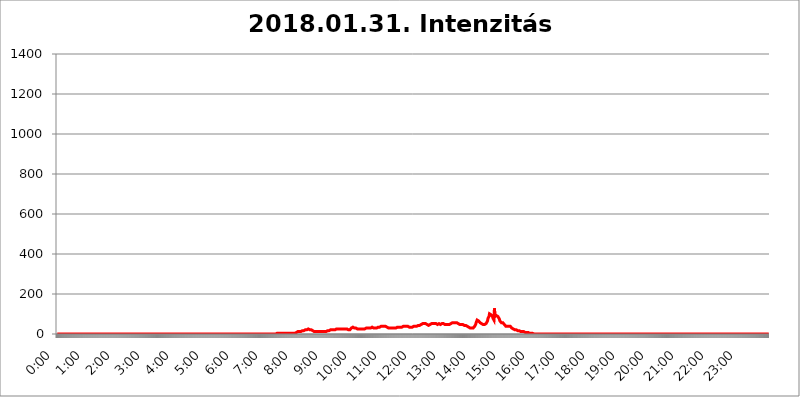
| Category | 2018.01.31. Intenzitás [W/m^2] |
|---|---|
| 0.0 | 0 |
| 0.0006944444444444445 | 0 |
| 0.001388888888888889 | 0 |
| 0.0020833333333333333 | 0 |
| 0.002777777777777778 | 0 |
| 0.003472222222222222 | 0 |
| 0.004166666666666667 | 0 |
| 0.004861111111111111 | 0 |
| 0.005555555555555556 | 0 |
| 0.0062499999999999995 | 0 |
| 0.006944444444444444 | 0 |
| 0.007638888888888889 | 0 |
| 0.008333333333333333 | 0 |
| 0.009027777777777779 | 0 |
| 0.009722222222222222 | 0 |
| 0.010416666666666666 | 0 |
| 0.011111111111111112 | 0 |
| 0.011805555555555555 | 0 |
| 0.012499999999999999 | 0 |
| 0.013194444444444444 | 0 |
| 0.013888888888888888 | 0 |
| 0.014583333333333332 | 0 |
| 0.015277777777777777 | 0 |
| 0.015972222222222224 | 0 |
| 0.016666666666666666 | 0 |
| 0.017361111111111112 | 0 |
| 0.018055555555555557 | 0 |
| 0.01875 | 0 |
| 0.019444444444444445 | 0 |
| 0.02013888888888889 | 0 |
| 0.020833333333333332 | 0 |
| 0.02152777777777778 | 0 |
| 0.022222222222222223 | 0 |
| 0.02291666666666667 | 0 |
| 0.02361111111111111 | 0 |
| 0.024305555555555556 | 0 |
| 0.024999999999999998 | 0 |
| 0.025694444444444447 | 0 |
| 0.02638888888888889 | 0 |
| 0.027083333333333334 | 0 |
| 0.027777777777777776 | 0 |
| 0.02847222222222222 | 0 |
| 0.029166666666666664 | 0 |
| 0.029861111111111113 | 0 |
| 0.030555555555555555 | 0 |
| 0.03125 | 0 |
| 0.03194444444444445 | 0 |
| 0.03263888888888889 | 0 |
| 0.03333333333333333 | 0 |
| 0.034027777777777775 | 0 |
| 0.034722222222222224 | 0 |
| 0.035416666666666666 | 0 |
| 0.036111111111111115 | 0 |
| 0.03680555555555556 | 0 |
| 0.0375 | 0 |
| 0.03819444444444444 | 0 |
| 0.03888888888888889 | 0 |
| 0.03958333333333333 | 0 |
| 0.04027777777777778 | 0 |
| 0.04097222222222222 | 0 |
| 0.041666666666666664 | 0 |
| 0.042361111111111106 | 0 |
| 0.04305555555555556 | 0 |
| 0.043750000000000004 | 0 |
| 0.044444444444444446 | 0 |
| 0.04513888888888889 | 0 |
| 0.04583333333333334 | 0 |
| 0.04652777777777778 | 0 |
| 0.04722222222222222 | 0 |
| 0.04791666666666666 | 0 |
| 0.04861111111111111 | 0 |
| 0.049305555555555554 | 0 |
| 0.049999999999999996 | 0 |
| 0.05069444444444445 | 0 |
| 0.051388888888888894 | 0 |
| 0.052083333333333336 | 0 |
| 0.05277777777777778 | 0 |
| 0.05347222222222222 | 0 |
| 0.05416666666666667 | 0 |
| 0.05486111111111111 | 0 |
| 0.05555555555555555 | 0 |
| 0.05625 | 0 |
| 0.05694444444444444 | 0 |
| 0.057638888888888885 | 0 |
| 0.05833333333333333 | 0 |
| 0.05902777777777778 | 0 |
| 0.059722222222222225 | 0 |
| 0.06041666666666667 | 0 |
| 0.061111111111111116 | 0 |
| 0.06180555555555556 | 0 |
| 0.0625 | 0 |
| 0.06319444444444444 | 0 |
| 0.06388888888888888 | 0 |
| 0.06458333333333334 | 0 |
| 0.06527777777777778 | 0 |
| 0.06597222222222222 | 0 |
| 0.06666666666666667 | 0 |
| 0.06736111111111111 | 0 |
| 0.06805555555555555 | 0 |
| 0.06874999999999999 | 0 |
| 0.06944444444444443 | 0 |
| 0.07013888888888889 | 0 |
| 0.07083333333333333 | 0 |
| 0.07152777777777779 | 0 |
| 0.07222222222222223 | 0 |
| 0.07291666666666667 | 0 |
| 0.07361111111111111 | 0 |
| 0.07430555555555556 | 0 |
| 0.075 | 0 |
| 0.07569444444444444 | 0 |
| 0.0763888888888889 | 0 |
| 0.07708333333333334 | 0 |
| 0.07777777777777778 | 0 |
| 0.07847222222222222 | 0 |
| 0.07916666666666666 | 0 |
| 0.0798611111111111 | 0 |
| 0.08055555555555556 | 0 |
| 0.08125 | 0 |
| 0.08194444444444444 | 0 |
| 0.08263888888888889 | 0 |
| 0.08333333333333333 | 0 |
| 0.08402777777777777 | 0 |
| 0.08472222222222221 | 0 |
| 0.08541666666666665 | 0 |
| 0.08611111111111112 | 0 |
| 0.08680555555555557 | 0 |
| 0.08750000000000001 | 0 |
| 0.08819444444444445 | 0 |
| 0.08888888888888889 | 0 |
| 0.08958333333333333 | 0 |
| 0.09027777777777778 | 0 |
| 0.09097222222222222 | 0 |
| 0.09166666666666667 | 0 |
| 0.09236111111111112 | 0 |
| 0.09305555555555556 | 0 |
| 0.09375 | 0 |
| 0.09444444444444444 | 0 |
| 0.09513888888888888 | 0 |
| 0.09583333333333333 | 0 |
| 0.09652777777777777 | 0 |
| 0.09722222222222222 | 0 |
| 0.09791666666666667 | 0 |
| 0.09861111111111111 | 0 |
| 0.09930555555555555 | 0 |
| 0.09999999999999999 | 0 |
| 0.10069444444444443 | 0 |
| 0.1013888888888889 | 0 |
| 0.10208333333333335 | 0 |
| 0.10277777777777779 | 0 |
| 0.10347222222222223 | 0 |
| 0.10416666666666667 | 0 |
| 0.10486111111111111 | 0 |
| 0.10555555555555556 | 0 |
| 0.10625 | 0 |
| 0.10694444444444444 | 0 |
| 0.1076388888888889 | 0 |
| 0.10833333333333334 | 0 |
| 0.10902777777777778 | 0 |
| 0.10972222222222222 | 0 |
| 0.1111111111111111 | 0 |
| 0.11180555555555556 | 0 |
| 0.11180555555555556 | 0 |
| 0.1125 | 0 |
| 0.11319444444444444 | 0 |
| 0.11388888888888889 | 0 |
| 0.11458333333333333 | 0 |
| 0.11527777777777777 | 0 |
| 0.11597222222222221 | 0 |
| 0.11666666666666665 | 0 |
| 0.1173611111111111 | 0 |
| 0.11805555555555557 | 0 |
| 0.11944444444444445 | 0 |
| 0.12013888888888889 | 0 |
| 0.12083333333333333 | 0 |
| 0.12152777777777778 | 0 |
| 0.12222222222222223 | 0 |
| 0.12291666666666667 | 0 |
| 0.12291666666666667 | 0 |
| 0.12361111111111112 | 0 |
| 0.12430555555555556 | 0 |
| 0.125 | 0 |
| 0.12569444444444444 | 0 |
| 0.12638888888888888 | 0 |
| 0.12708333333333333 | 0 |
| 0.16875 | 0 |
| 0.12847222222222224 | 0 |
| 0.12916666666666668 | 0 |
| 0.12986111111111112 | 0 |
| 0.13055555555555556 | 0 |
| 0.13125 | 0 |
| 0.13194444444444445 | 0 |
| 0.1326388888888889 | 0 |
| 0.13333333333333333 | 0 |
| 0.13402777777777777 | 0 |
| 0.13402777777777777 | 0 |
| 0.13472222222222222 | 0 |
| 0.13541666666666666 | 0 |
| 0.1361111111111111 | 0 |
| 0.13749999999999998 | 0 |
| 0.13819444444444443 | 0 |
| 0.1388888888888889 | 0 |
| 0.13958333333333334 | 0 |
| 0.14027777777777778 | 0 |
| 0.14097222222222222 | 0 |
| 0.14166666666666666 | 0 |
| 0.1423611111111111 | 0 |
| 0.14305555555555557 | 0 |
| 0.14375000000000002 | 0 |
| 0.14444444444444446 | 0 |
| 0.1451388888888889 | 0 |
| 0.1451388888888889 | 0 |
| 0.14652777777777778 | 0 |
| 0.14722222222222223 | 0 |
| 0.14791666666666667 | 0 |
| 0.1486111111111111 | 0 |
| 0.14930555555555555 | 0 |
| 0.15 | 0 |
| 0.15069444444444444 | 0 |
| 0.15138888888888888 | 0 |
| 0.15208333333333332 | 0 |
| 0.15277777777777776 | 0 |
| 0.15347222222222223 | 0 |
| 0.15416666666666667 | 0 |
| 0.15486111111111112 | 0 |
| 0.15555555555555556 | 0 |
| 0.15625 | 0 |
| 0.15694444444444444 | 0 |
| 0.15763888888888888 | 0 |
| 0.15833333333333333 | 0 |
| 0.15902777777777777 | 0 |
| 0.15972222222222224 | 0 |
| 0.16041666666666668 | 0 |
| 0.16111111111111112 | 0 |
| 0.16180555555555556 | 0 |
| 0.1625 | 0 |
| 0.16319444444444445 | 0 |
| 0.1638888888888889 | 0 |
| 0.16458333333333333 | 0 |
| 0.16527777777777777 | 0 |
| 0.16597222222222222 | 0 |
| 0.16666666666666666 | 0 |
| 0.1673611111111111 | 0 |
| 0.16805555555555554 | 0 |
| 0.16874999999999998 | 0 |
| 0.16944444444444443 | 0 |
| 0.17013888888888887 | 0 |
| 0.1708333333333333 | 0 |
| 0.17152777777777775 | 0 |
| 0.17222222222222225 | 0 |
| 0.1729166666666667 | 0 |
| 0.17361111111111113 | 0 |
| 0.17430555555555557 | 0 |
| 0.17500000000000002 | 0 |
| 0.17569444444444446 | 0 |
| 0.1763888888888889 | 0 |
| 0.17708333333333334 | 0 |
| 0.17777777777777778 | 0 |
| 0.17847222222222223 | 0 |
| 0.17916666666666667 | 0 |
| 0.1798611111111111 | 0 |
| 0.18055555555555555 | 0 |
| 0.18125 | 0 |
| 0.18194444444444444 | 0 |
| 0.1826388888888889 | 0 |
| 0.18333333333333335 | 0 |
| 0.1840277777777778 | 0 |
| 0.18472222222222223 | 0 |
| 0.18541666666666667 | 0 |
| 0.18611111111111112 | 0 |
| 0.18680555555555556 | 0 |
| 0.1875 | 0 |
| 0.18819444444444444 | 0 |
| 0.18888888888888888 | 0 |
| 0.18958333333333333 | 0 |
| 0.19027777777777777 | 0 |
| 0.1909722222222222 | 0 |
| 0.19166666666666665 | 0 |
| 0.19236111111111112 | 0 |
| 0.19305555555555554 | 0 |
| 0.19375 | 0 |
| 0.19444444444444445 | 0 |
| 0.1951388888888889 | 0 |
| 0.19583333333333333 | 0 |
| 0.19652777777777777 | 0 |
| 0.19722222222222222 | 0 |
| 0.19791666666666666 | 0 |
| 0.1986111111111111 | 0 |
| 0.19930555555555554 | 0 |
| 0.19999999999999998 | 0 |
| 0.20069444444444443 | 0 |
| 0.20138888888888887 | 0 |
| 0.2020833333333333 | 0 |
| 0.2027777777777778 | 0 |
| 0.2034722222222222 | 0 |
| 0.2041666666666667 | 0 |
| 0.20486111111111113 | 0 |
| 0.20555555555555557 | 0 |
| 0.20625000000000002 | 0 |
| 0.20694444444444446 | 0 |
| 0.2076388888888889 | 0 |
| 0.20833333333333334 | 0 |
| 0.20902777777777778 | 0 |
| 0.20972222222222223 | 0 |
| 0.21041666666666667 | 0 |
| 0.2111111111111111 | 0 |
| 0.21180555555555555 | 0 |
| 0.2125 | 0 |
| 0.21319444444444444 | 0 |
| 0.2138888888888889 | 0 |
| 0.21458333333333335 | 0 |
| 0.2152777777777778 | 0 |
| 0.21597222222222223 | 0 |
| 0.21666666666666667 | 0 |
| 0.21736111111111112 | 0 |
| 0.21805555555555556 | 0 |
| 0.21875 | 0 |
| 0.21944444444444444 | 0 |
| 0.22013888888888888 | 0 |
| 0.22083333333333333 | 0 |
| 0.22152777777777777 | 0 |
| 0.2222222222222222 | 0 |
| 0.22291666666666665 | 0 |
| 0.2236111111111111 | 0 |
| 0.22430555555555556 | 0 |
| 0.225 | 0 |
| 0.22569444444444445 | 0 |
| 0.2263888888888889 | 0 |
| 0.22708333333333333 | 0 |
| 0.22777777777777777 | 0 |
| 0.22847222222222222 | 0 |
| 0.22916666666666666 | 0 |
| 0.2298611111111111 | 0 |
| 0.23055555555555554 | 0 |
| 0.23124999999999998 | 0 |
| 0.23194444444444443 | 0 |
| 0.23263888888888887 | 0 |
| 0.2333333333333333 | 0 |
| 0.2340277777777778 | 0 |
| 0.2347222222222222 | 0 |
| 0.2354166666666667 | 0 |
| 0.23611111111111113 | 0 |
| 0.23680555555555557 | 0 |
| 0.23750000000000002 | 0 |
| 0.23819444444444446 | 0 |
| 0.2388888888888889 | 0 |
| 0.23958333333333334 | 0 |
| 0.24027777777777778 | 0 |
| 0.24097222222222223 | 0 |
| 0.24166666666666667 | 0 |
| 0.2423611111111111 | 0 |
| 0.24305555555555555 | 0 |
| 0.24375 | 0 |
| 0.24444444444444446 | 0 |
| 0.24513888888888888 | 0 |
| 0.24583333333333335 | 0 |
| 0.2465277777777778 | 0 |
| 0.24722222222222223 | 0 |
| 0.24791666666666667 | 0 |
| 0.24861111111111112 | 0 |
| 0.24930555555555556 | 0 |
| 0.25 | 0 |
| 0.25069444444444444 | 0 |
| 0.2513888888888889 | 0 |
| 0.2520833333333333 | 0 |
| 0.25277777777777777 | 0 |
| 0.2534722222222222 | 0 |
| 0.25416666666666665 | 0 |
| 0.2548611111111111 | 0 |
| 0.2555555555555556 | 0 |
| 0.25625000000000003 | 0 |
| 0.2569444444444445 | 0 |
| 0.2576388888888889 | 0 |
| 0.25833333333333336 | 0 |
| 0.2590277777777778 | 0 |
| 0.25972222222222224 | 0 |
| 0.2604166666666667 | 0 |
| 0.2611111111111111 | 0 |
| 0.26180555555555557 | 0 |
| 0.2625 | 0 |
| 0.26319444444444445 | 0 |
| 0.2638888888888889 | 0 |
| 0.26458333333333334 | 0 |
| 0.2652777777777778 | 0 |
| 0.2659722222222222 | 0 |
| 0.26666666666666666 | 0 |
| 0.2673611111111111 | 0 |
| 0.26805555555555555 | 0 |
| 0.26875 | 0 |
| 0.26944444444444443 | 0 |
| 0.2701388888888889 | 0 |
| 0.2708333333333333 | 0 |
| 0.27152777777777776 | 0 |
| 0.2722222222222222 | 0 |
| 0.27291666666666664 | 0 |
| 0.2736111111111111 | 0 |
| 0.2743055555555555 | 0 |
| 0.27499999999999997 | 0 |
| 0.27569444444444446 | 0 |
| 0.27638888888888885 | 0 |
| 0.27708333333333335 | 0 |
| 0.2777777777777778 | 0 |
| 0.27847222222222223 | 0 |
| 0.2791666666666667 | 0 |
| 0.2798611111111111 | 0 |
| 0.28055555555555556 | 0 |
| 0.28125 | 0 |
| 0.28194444444444444 | 0 |
| 0.2826388888888889 | 0 |
| 0.2833333333333333 | 0 |
| 0.28402777777777777 | 0 |
| 0.2847222222222222 | 0 |
| 0.28541666666666665 | 0 |
| 0.28611111111111115 | 0 |
| 0.28680555555555554 | 0 |
| 0.28750000000000003 | 0 |
| 0.2881944444444445 | 0 |
| 0.2888888888888889 | 0 |
| 0.28958333333333336 | 0 |
| 0.2902777777777778 | 0 |
| 0.29097222222222224 | 0 |
| 0.2916666666666667 | 0 |
| 0.2923611111111111 | 0 |
| 0.29305555555555557 | 0 |
| 0.29375 | 0 |
| 0.29444444444444445 | 0 |
| 0.2951388888888889 | 0 |
| 0.29583333333333334 | 0 |
| 0.2965277777777778 | 0 |
| 0.2972222222222222 | 0 |
| 0.29791666666666666 | 0 |
| 0.2986111111111111 | 0 |
| 0.29930555555555555 | 0 |
| 0.3 | 0 |
| 0.30069444444444443 | 0 |
| 0.3013888888888889 | 0 |
| 0.3020833333333333 | 0 |
| 0.30277777777777776 | 0 |
| 0.3034722222222222 | 0 |
| 0.30416666666666664 | 0 |
| 0.3048611111111111 | 0 |
| 0.3055555555555555 | 0 |
| 0.30624999999999997 | 0 |
| 0.3069444444444444 | 3.525 |
| 0.3076388888888889 | 0 |
| 0.30833333333333335 | 3.525 |
| 0.3090277777777778 | 3.525 |
| 0.30972222222222223 | 3.525 |
| 0.3104166666666667 | 3.525 |
| 0.3111111111111111 | 3.525 |
| 0.31180555555555556 | 3.525 |
| 0.3125 | 3.525 |
| 0.31319444444444444 | 3.525 |
| 0.3138888888888889 | 3.525 |
| 0.3145833333333333 | 3.525 |
| 0.31527777777777777 | 3.525 |
| 0.3159722222222222 | 3.525 |
| 0.31666666666666665 | 3.525 |
| 0.31736111111111115 | 3.525 |
| 0.31805555555555554 | 3.525 |
| 0.31875000000000003 | 3.525 |
| 0.3194444444444445 | 3.525 |
| 0.3201388888888889 | 3.525 |
| 0.32083333333333336 | 3.525 |
| 0.3215277777777778 | 3.525 |
| 0.32222222222222224 | 3.525 |
| 0.3229166666666667 | 3.525 |
| 0.3236111111111111 | 3.525 |
| 0.32430555555555557 | 3.525 |
| 0.325 | 3.525 |
| 0.32569444444444445 | 3.525 |
| 0.3263888888888889 | 3.525 |
| 0.32708333333333334 | 3.525 |
| 0.3277777777777778 | 3.525 |
| 0.3284722222222222 | 3.525 |
| 0.32916666666666666 | 3.525 |
| 0.3298611111111111 | 3.525 |
| 0.33055555555555555 | 3.525 |
| 0.33125 | 3.525 |
| 0.33194444444444443 | 3.525 |
| 0.3326388888888889 | 3.525 |
| 0.3333333333333333 | 3.525 |
| 0.3340277777777778 | 7.887 |
| 0.3347222222222222 | 7.887 |
| 0.3354166666666667 | 7.887 |
| 0.3361111111111111 | 7.887 |
| 0.3368055555555556 | 7.887 |
| 0.33749999999999997 | 12.257 |
| 0.33819444444444446 | 12.257 |
| 0.33888888888888885 | 12.257 |
| 0.33958333333333335 | 12.257 |
| 0.34027777777777773 | 12.257 |
| 0.34097222222222223 | 12.257 |
| 0.3416666666666666 | 12.257 |
| 0.3423611111111111 | 12.257 |
| 0.3430555555555555 | 12.257 |
| 0.34375 | 16.636 |
| 0.3444444444444445 | 16.636 |
| 0.3451388888888889 | 16.636 |
| 0.3458333333333334 | 16.636 |
| 0.34652777777777777 | 16.636 |
| 0.34722222222222227 | 16.636 |
| 0.34791666666666665 | 21.024 |
| 0.34861111111111115 | 21.024 |
| 0.34930555555555554 | 21.024 |
| 0.35000000000000003 | 21.024 |
| 0.3506944444444444 | 25.419 |
| 0.3513888888888889 | 25.419 |
| 0.3520833333333333 | 25.419 |
| 0.3527777777777778 | 21.024 |
| 0.3534722222222222 | 21.024 |
| 0.3541666666666667 | 21.024 |
| 0.3548611111111111 | 21.024 |
| 0.35555555555555557 | 21.024 |
| 0.35625 | 21.024 |
| 0.35694444444444445 | 16.636 |
| 0.3576388888888889 | 16.636 |
| 0.35833333333333334 | 16.636 |
| 0.3590277777777778 | 16.636 |
| 0.3597222222222222 | 12.257 |
| 0.36041666666666666 | 12.257 |
| 0.3611111111111111 | 12.257 |
| 0.36180555555555555 | 16.636 |
| 0.3625 | 12.257 |
| 0.36319444444444443 | 12.257 |
| 0.3638888888888889 | 12.257 |
| 0.3645833333333333 | 12.257 |
| 0.3652777777777778 | 16.636 |
| 0.3659722222222222 | 12.257 |
| 0.3666666666666667 | 12.257 |
| 0.3673611111111111 | 12.257 |
| 0.3680555555555556 | 12.257 |
| 0.36874999999999997 | 12.257 |
| 0.36944444444444446 | 12.257 |
| 0.37013888888888885 | 12.257 |
| 0.37083333333333335 | 12.257 |
| 0.37152777777777773 | 12.257 |
| 0.37222222222222223 | 12.257 |
| 0.3729166666666666 | 12.257 |
| 0.3736111111111111 | 12.257 |
| 0.3743055555555555 | 12.257 |
| 0.375 | 12.257 |
| 0.3756944444444445 | 12.257 |
| 0.3763888888888889 | 12.257 |
| 0.3770833333333334 | 12.257 |
| 0.37777777777777777 | 12.257 |
| 0.37847222222222227 | 12.257 |
| 0.37916666666666665 | 16.636 |
| 0.37986111111111115 | 16.636 |
| 0.38055555555555554 | 16.636 |
| 0.38125000000000003 | 16.636 |
| 0.3819444444444444 | 16.636 |
| 0.3826388888888889 | 16.636 |
| 0.3833333333333333 | 21.024 |
| 0.3840277777777778 | 21.024 |
| 0.3847222222222222 | 21.024 |
| 0.3854166666666667 | 21.024 |
| 0.3861111111111111 | 21.024 |
| 0.38680555555555557 | 21.024 |
| 0.3875 | 21.024 |
| 0.38819444444444445 | 21.024 |
| 0.3888888888888889 | 21.024 |
| 0.38958333333333334 | 21.024 |
| 0.3902777777777778 | 21.024 |
| 0.3909722222222222 | 21.024 |
| 0.39166666666666666 | 25.419 |
| 0.3923611111111111 | 25.419 |
| 0.39305555555555555 | 25.419 |
| 0.39375 | 25.419 |
| 0.39444444444444443 | 29.823 |
| 0.3951388888888889 | 25.419 |
| 0.3958333333333333 | 25.419 |
| 0.3965277777777778 | 25.419 |
| 0.3972222222222222 | 25.419 |
| 0.3979166666666667 | 25.419 |
| 0.3986111111111111 | 25.419 |
| 0.3993055555555556 | 21.024 |
| 0.39999999999999997 | 25.419 |
| 0.40069444444444446 | 25.419 |
| 0.40138888888888885 | 25.419 |
| 0.40208333333333335 | 25.419 |
| 0.40277777777777773 | 21.024 |
| 0.40347222222222223 | 21.024 |
| 0.4041666666666666 | 25.419 |
| 0.4048611111111111 | 25.419 |
| 0.4055555555555555 | 25.419 |
| 0.40625 | 25.419 |
| 0.4069444444444445 | 21.024 |
| 0.4076388888888889 | 21.024 |
| 0.4083333333333334 | 21.024 |
| 0.40902777777777777 | 21.024 |
| 0.40972222222222227 | 21.024 |
| 0.41041666666666665 | 21.024 |
| 0.41111111111111115 | 21.024 |
| 0.41180555555555554 | 25.419 |
| 0.41250000000000003 | 29.823 |
| 0.4131944444444444 | 29.823 |
| 0.4138888888888889 | 34.234 |
| 0.4145833333333333 | 34.234 |
| 0.4152777777777778 | 34.234 |
| 0.4159722222222222 | 34.234 |
| 0.4166666666666667 | 29.823 |
| 0.4173611111111111 | 29.823 |
| 0.41805555555555557 | 29.823 |
| 0.41875 | 29.823 |
| 0.41944444444444445 | 29.823 |
| 0.4201388888888889 | 25.419 |
| 0.42083333333333334 | 25.419 |
| 0.4215277777777778 | 21.024 |
| 0.4222222222222222 | 21.024 |
| 0.42291666666666666 | 25.419 |
| 0.4236111111111111 | 25.419 |
| 0.42430555555555555 | 25.419 |
| 0.425 | 25.419 |
| 0.42569444444444443 | 25.419 |
| 0.4263888888888889 | 25.419 |
| 0.4270833333333333 | 25.419 |
| 0.4277777777777778 | 25.419 |
| 0.4284722222222222 | 25.419 |
| 0.4291666666666667 | 25.419 |
| 0.4298611111111111 | 25.419 |
| 0.4305555555555556 | 25.419 |
| 0.43124999999999997 | 25.419 |
| 0.43194444444444446 | 25.419 |
| 0.43263888888888885 | 25.419 |
| 0.43333333333333335 | 29.823 |
| 0.43402777777777773 | 29.823 |
| 0.43472222222222223 | 29.823 |
| 0.4354166666666666 | 29.823 |
| 0.4361111111111111 | 29.823 |
| 0.4368055555555555 | 29.823 |
| 0.4375 | 29.823 |
| 0.4381944444444445 | 29.823 |
| 0.4388888888888889 | 29.823 |
| 0.4395833333333334 | 29.823 |
| 0.44027777777777777 | 34.234 |
| 0.44097222222222227 | 34.234 |
| 0.44166666666666665 | 34.234 |
| 0.44236111111111115 | 34.234 |
| 0.44305555555555554 | 29.823 |
| 0.44375000000000003 | 29.823 |
| 0.4444444444444444 | 29.823 |
| 0.4451388888888889 | 29.823 |
| 0.4458333333333333 | 29.823 |
| 0.4465277777777778 | 29.823 |
| 0.4472222222222222 | 29.823 |
| 0.4479166666666667 | 29.823 |
| 0.4486111111111111 | 29.823 |
| 0.44930555555555557 | 34.234 |
| 0.45 | 34.234 |
| 0.45069444444444445 | 34.234 |
| 0.4513888888888889 | 34.234 |
| 0.45208333333333334 | 34.234 |
| 0.4527777777777778 | 34.234 |
| 0.4534722222222222 | 38.653 |
| 0.45416666666666666 | 38.653 |
| 0.4548611111111111 | 38.653 |
| 0.45555555555555555 | 38.653 |
| 0.45625 | 38.653 |
| 0.45694444444444443 | 38.653 |
| 0.4576388888888889 | 38.653 |
| 0.4583333333333333 | 38.653 |
| 0.4590277777777778 | 38.653 |
| 0.4597222222222222 | 38.653 |
| 0.4604166666666667 | 38.653 |
| 0.4611111111111111 | 34.234 |
| 0.4618055555555556 | 34.234 |
| 0.46249999999999997 | 34.234 |
| 0.46319444444444446 | 34.234 |
| 0.46388888888888885 | 29.823 |
| 0.46458333333333335 | 29.823 |
| 0.46527777777777773 | 34.234 |
| 0.46597222222222223 | 34.234 |
| 0.4666666666666666 | 29.823 |
| 0.4673611111111111 | 29.823 |
| 0.4680555555555555 | 29.823 |
| 0.46875 | 29.823 |
| 0.4694444444444445 | 29.823 |
| 0.4701388888888889 | 29.823 |
| 0.4708333333333334 | 29.823 |
| 0.47152777777777777 | 29.823 |
| 0.47222222222222227 | 29.823 |
| 0.47291666666666665 | 29.823 |
| 0.47361111111111115 | 29.823 |
| 0.47430555555555554 | 29.823 |
| 0.47500000000000003 | 29.823 |
| 0.4756944444444444 | 29.823 |
| 0.4763888888888889 | 29.823 |
| 0.4770833333333333 | 34.234 |
| 0.4777777777777778 | 34.234 |
| 0.4784722222222222 | 34.234 |
| 0.4791666666666667 | 34.234 |
| 0.4798611111111111 | 34.234 |
| 0.48055555555555557 | 29.823 |
| 0.48125 | 34.234 |
| 0.48194444444444445 | 34.234 |
| 0.4826388888888889 | 34.234 |
| 0.48333333333333334 | 34.234 |
| 0.4840277777777778 | 38.653 |
| 0.4847222222222222 | 38.653 |
| 0.48541666666666666 | 38.653 |
| 0.4861111111111111 | 38.653 |
| 0.48680555555555555 | 38.653 |
| 0.4875 | 38.653 |
| 0.48819444444444443 | 38.653 |
| 0.4888888888888889 | 38.653 |
| 0.4895833333333333 | 38.653 |
| 0.4902777777777778 | 38.653 |
| 0.4909722222222222 | 38.653 |
| 0.4916666666666667 | 38.653 |
| 0.4923611111111111 | 34.234 |
| 0.4930555555555556 | 34.234 |
| 0.49374999999999997 | 34.234 |
| 0.49444444444444446 | 34.234 |
| 0.49513888888888885 | 34.234 |
| 0.49583333333333335 | 34.234 |
| 0.49652777777777773 | 34.234 |
| 0.49722222222222223 | 34.234 |
| 0.4979166666666666 | 34.234 |
| 0.4986111111111111 | 34.234 |
| 0.4993055555555555 | 34.234 |
| 0.5 | 38.653 |
| 0.5006944444444444 | 38.653 |
| 0.5013888888888889 | 38.653 |
| 0.5020833333333333 | 38.653 |
| 0.5027777777777778 | 38.653 |
| 0.5034722222222222 | 38.653 |
| 0.5041666666666667 | 38.653 |
| 0.5048611111111111 | 38.653 |
| 0.5055555555555555 | 43.079 |
| 0.50625 | 43.079 |
| 0.5069444444444444 | 43.079 |
| 0.5076388888888889 | 43.079 |
| 0.5083333333333333 | 43.079 |
| 0.5090277777777777 | 43.079 |
| 0.5097222222222222 | 43.079 |
| 0.5104166666666666 | 47.511 |
| 0.5111111111111112 | 47.511 |
| 0.5118055555555555 | 51.951 |
| 0.5125000000000001 | 51.951 |
| 0.5131944444444444 | 56.398 |
| 0.513888888888889 | 56.398 |
| 0.5145833333333333 | 51.951 |
| 0.5152777777777778 | 51.951 |
| 0.5159722222222222 | 51.951 |
| 0.5166666666666667 | 51.951 |
| 0.517361111111111 | 51.951 |
| 0.5180555555555556 | 47.511 |
| 0.5187499999999999 | 47.511 |
| 0.5194444444444445 | 43.079 |
| 0.5201388888888888 | 43.079 |
| 0.5208333333333334 | 43.079 |
| 0.5215277777777778 | 47.511 |
| 0.5222222222222223 | 47.511 |
| 0.5229166666666667 | 47.511 |
| 0.5236111111111111 | 47.511 |
| 0.5243055555555556 | 47.511 |
| 0.525 | 51.951 |
| 0.5256944444444445 | 51.951 |
| 0.5263888888888889 | 51.951 |
| 0.5270833333333333 | 51.951 |
| 0.5277777777777778 | 51.951 |
| 0.5284722222222222 | 51.951 |
| 0.5291666666666667 | 51.951 |
| 0.5298611111111111 | 51.951 |
| 0.5305555555555556 | 51.951 |
| 0.53125 | 51.951 |
| 0.5319444444444444 | 47.511 |
| 0.5326388888888889 | 47.511 |
| 0.5333333333333333 | 47.511 |
| 0.5340277777777778 | 51.951 |
| 0.5347222222222222 | 47.511 |
| 0.5354166666666667 | 51.951 |
| 0.5361111111111111 | 51.951 |
| 0.5368055555555555 | 51.951 |
| 0.5375 | 47.511 |
| 0.5381944444444444 | 47.511 |
| 0.5388888888888889 | 47.511 |
| 0.5395833333333333 | 51.951 |
| 0.5402777777777777 | 47.511 |
| 0.5409722222222222 | 47.511 |
| 0.5416666666666666 | 51.951 |
| 0.5423611111111112 | 47.511 |
| 0.5430555555555555 | 47.511 |
| 0.5437500000000001 | 47.511 |
| 0.5444444444444444 | 47.511 |
| 0.545138888888889 | 47.511 |
| 0.5458333333333333 | 47.511 |
| 0.5465277777777778 | 47.511 |
| 0.5472222222222222 | 47.511 |
| 0.5479166666666667 | 47.511 |
| 0.548611111111111 | 47.511 |
| 0.5493055555555556 | 47.511 |
| 0.5499999999999999 | 47.511 |
| 0.5506944444444445 | 47.511 |
| 0.5513888888888888 | 47.511 |
| 0.5520833333333334 | 51.951 |
| 0.5527777777777778 | 51.951 |
| 0.5534722222222223 | 51.951 |
| 0.5541666666666667 | 56.398 |
| 0.5548611111111111 | 56.398 |
| 0.5555555555555556 | 56.398 |
| 0.55625 | 56.398 |
| 0.5569444444444445 | 56.398 |
| 0.5576388888888889 | 56.398 |
| 0.5583333333333333 | 56.398 |
| 0.5590277777777778 | 56.398 |
| 0.5597222222222222 | 56.398 |
| 0.5604166666666667 | 56.398 |
| 0.5611111111111111 | 56.398 |
| 0.5618055555555556 | 51.951 |
| 0.5625 | 51.951 |
| 0.5631944444444444 | 47.511 |
| 0.5638888888888889 | 47.511 |
| 0.5645833333333333 | 47.511 |
| 0.5652777777777778 | 47.511 |
| 0.5659722222222222 | 47.511 |
| 0.5666666666666667 | 47.511 |
| 0.5673611111111111 | 47.511 |
| 0.5680555555555555 | 47.511 |
| 0.56875 | 47.511 |
| 0.5694444444444444 | 47.511 |
| 0.5701388888888889 | 47.511 |
| 0.5708333333333333 | 43.079 |
| 0.5715277777777777 | 43.079 |
| 0.5722222222222222 | 43.079 |
| 0.5729166666666666 | 43.079 |
| 0.5736111111111112 | 38.653 |
| 0.5743055555555555 | 38.653 |
| 0.5750000000000001 | 38.653 |
| 0.5756944444444444 | 38.653 |
| 0.576388888888889 | 34.234 |
| 0.5770833333333333 | 34.234 |
| 0.5777777777777778 | 29.823 |
| 0.5784722222222222 | 29.823 |
| 0.5791666666666667 | 29.823 |
| 0.579861111111111 | 29.823 |
| 0.5805555555555556 | 29.823 |
| 0.5812499999999999 | 29.823 |
| 0.5819444444444445 | 29.823 |
| 0.5826388888888888 | 29.823 |
| 0.5833333333333334 | 29.823 |
| 0.5840277777777778 | 34.234 |
| 0.5847222222222223 | 34.234 |
| 0.5854166666666667 | 38.653 |
| 0.5861111111111111 | 43.079 |
| 0.5868055555555556 | 47.511 |
| 0.5875 | 56.398 |
| 0.5881944444444445 | 60.85 |
| 0.5888888888888889 | 69.775 |
| 0.5895833333333333 | 69.775 |
| 0.5902777777777778 | 69.775 |
| 0.5909722222222222 | 65.31 |
| 0.5916666666666667 | 65.31 |
| 0.5923611111111111 | 60.85 |
| 0.5930555555555556 | 56.398 |
| 0.59375 | 51.951 |
| 0.5944444444444444 | 51.951 |
| 0.5951388888888889 | 51.951 |
| 0.5958333333333333 | 51.951 |
| 0.5965277777777778 | 51.951 |
| 0.5972222222222222 | 47.511 |
| 0.5979166666666667 | 47.511 |
| 0.5986111111111111 | 47.511 |
| 0.5993055555555555 | 47.511 |
| 0.6 | 47.511 |
| 0.6006944444444444 | 51.951 |
| 0.6013888888888889 | 51.951 |
| 0.6020833333333333 | 47.511 |
| 0.6027777777777777 | 51.951 |
| 0.6034722222222222 | 65.31 |
| 0.6041666666666666 | 78.722 |
| 0.6048611111111112 | 83.205 |
| 0.6055555555555555 | 87.692 |
| 0.6062500000000001 | 101.184 |
| 0.6069444444444444 | 105.69 |
| 0.607638888888889 | 101.184 |
| 0.6083333333333333 | 96.682 |
| 0.6090277777777778 | 96.682 |
| 0.6097222222222222 | 92.184 |
| 0.6104166666666667 | 87.692 |
| 0.611111111111111 | 78.722 |
| 0.6118055555555556 | 74.246 |
| 0.6124999999999999 | 69.775 |
| 0.6131944444444445 | 128.284 |
| 0.6138888888888888 | 87.692 |
| 0.6145833333333334 | 83.205 |
| 0.6152777777777778 | 92.184 |
| 0.6159722222222223 | 92.184 |
| 0.6166666666666667 | 92.184 |
| 0.6173611111111111 | 92.184 |
| 0.6180555555555556 | 87.692 |
| 0.61875 | 83.205 |
| 0.6194444444444445 | 83.205 |
| 0.6201388888888889 | 74.246 |
| 0.6208333333333333 | 65.31 |
| 0.6215277777777778 | 60.85 |
| 0.6222222222222222 | 60.85 |
| 0.6229166666666667 | 56.398 |
| 0.6236111111111111 | 56.398 |
| 0.6243055555555556 | 56.398 |
| 0.625 | 56.398 |
| 0.6256944444444444 | 56.398 |
| 0.6263888888888889 | 51.951 |
| 0.6270833333333333 | 47.511 |
| 0.6277777777777778 | 43.079 |
| 0.6284722222222222 | 43.079 |
| 0.6291666666666667 | 38.653 |
| 0.6298611111111111 | 38.653 |
| 0.6305555555555555 | 38.653 |
| 0.63125 | 38.653 |
| 0.6319444444444444 | 38.653 |
| 0.6326388888888889 | 38.653 |
| 0.6333333333333333 | 38.653 |
| 0.6340277777777777 | 38.653 |
| 0.6347222222222222 | 38.653 |
| 0.6354166666666666 | 38.653 |
| 0.6361111111111112 | 38.653 |
| 0.6368055555555555 | 34.234 |
| 0.6375000000000001 | 29.823 |
| 0.6381944444444444 | 29.823 |
| 0.638888888888889 | 25.419 |
| 0.6395833333333333 | 25.419 |
| 0.6402777777777778 | 21.024 |
| 0.6409722222222222 | 21.024 |
| 0.6416666666666667 | 21.024 |
| 0.642361111111111 | 21.024 |
| 0.6430555555555556 | 21.024 |
| 0.6437499999999999 | 21.024 |
| 0.6444444444444445 | 21.024 |
| 0.6451388888888888 | 16.636 |
| 0.6458333333333334 | 16.636 |
| 0.6465277777777778 | 16.636 |
| 0.6472222222222223 | 16.636 |
| 0.6479166666666667 | 16.636 |
| 0.6486111111111111 | 16.636 |
| 0.6493055555555556 | 12.257 |
| 0.65 | 12.257 |
| 0.6506944444444445 | 12.257 |
| 0.6513888888888889 | 12.257 |
| 0.6520833333333333 | 12.257 |
| 0.6527777777777778 | 12.257 |
| 0.6534722222222222 | 12.257 |
| 0.6541666666666667 | 12.257 |
| 0.6548611111111111 | 12.257 |
| 0.6555555555555556 | 12.257 |
| 0.65625 | 7.887 |
| 0.6569444444444444 | 7.887 |
| 0.6576388888888889 | 7.887 |
| 0.6583333333333333 | 7.887 |
| 0.6590277777777778 | 7.887 |
| 0.6597222222222222 | 7.887 |
| 0.6604166666666667 | 7.887 |
| 0.6611111111111111 | 3.525 |
| 0.6618055555555555 | 3.525 |
| 0.6625 | 3.525 |
| 0.6631944444444444 | 3.525 |
| 0.6638888888888889 | 3.525 |
| 0.6645833333333333 | 3.525 |
| 0.6652777777777777 | 3.525 |
| 0.6659722222222222 | 3.525 |
| 0.6666666666666666 | 3.525 |
| 0.6673611111111111 | 3.525 |
| 0.6680555555555556 | 3.525 |
| 0.6687500000000001 | 0 |
| 0.6694444444444444 | 0 |
| 0.6701388888888888 | 0 |
| 0.6708333333333334 | 0 |
| 0.6715277777777778 | 0 |
| 0.6722222222222222 | 0 |
| 0.6729166666666666 | 0 |
| 0.6736111111111112 | 0 |
| 0.6743055555555556 | 0 |
| 0.6749999999999999 | 0 |
| 0.6756944444444444 | 0 |
| 0.6763888888888889 | 0 |
| 0.6770833333333334 | 0 |
| 0.6777777777777777 | 0 |
| 0.6784722222222223 | 0 |
| 0.6791666666666667 | 0 |
| 0.6798611111111111 | 0 |
| 0.6805555555555555 | 0 |
| 0.68125 | 0 |
| 0.6819444444444445 | 0 |
| 0.6826388888888889 | 0 |
| 0.6833333333333332 | 0 |
| 0.6840277777777778 | 0 |
| 0.6847222222222222 | 0 |
| 0.6854166666666667 | 0 |
| 0.686111111111111 | 0 |
| 0.6868055555555556 | 0 |
| 0.6875 | 0 |
| 0.6881944444444444 | 0 |
| 0.688888888888889 | 0 |
| 0.6895833333333333 | 0 |
| 0.6902777777777778 | 0 |
| 0.6909722222222222 | 0 |
| 0.6916666666666668 | 0 |
| 0.6923611111111111 | 0 |
| 0.6930555555555555 | 0 |
| 0.69375 | 0 |
| 0.6944444444444445 | 0 |
| 0.6951388888888889 | 0 |
| 0.6958333333333333 | 0 |
| 0.6965277777777777 | 0 |
| 0.6972222222222223 | 0 |
| 0.6979166666666666 | 0 |
| 0.6986111111111111 | 0 |
| 0.6993055555555556 | 0 |
| 0.7000000000000001 | 0 |
| 0.7006944444444444 | 0 |
| 0.7013888888888888 | 0 |
| 0.7020833333333334 | 0 |
| 0.7027777777777778 | 0 |
| 0.7034722222222222 | 0 |
| 0.7041666666666666 | 0 |
| 0.7048611111111112 | 0 |
| 0.7055555555555556 | 0 |
| 0.7062499999999999 | 0 |
| 0.7069444444444444 | 0 |
| 0.7076388888888889 | 0 |
| 0.7083333333333334 | 0 |
| 0.7090277777777777 | 0 |
| 0.7097222222222223 | 0 |
| 0.7104166666666667 | 0 |
| 0.7111111111111111 | 0 |
| 0.7118055555555555 | 0 |
| 0.7125 | 0 |
| 0.7131944444444445 | 0 |
| 0.7138888888888889 | 0 |
| 0.7145833333333332 | 0 |
| 0.7152777777777778 | 0 |
| 0.7159722222222222 | 0 |
| 0.7166666666666667 | 0 |
| 0.717361111111111 | 0 |
| 0.7180555555555556 | 0 |
| 0.71875 | 0 |
| 0.7194444444444444 | 0 |
| 0.720138888888889 | 0 |
| 0.7208333333333333 | 0 |
| 0.7215277777777778 | 0 |
| 0.7222222222222222 | 0 |
| 0.7229166666666668 | 0 |
| 0.7236111111111111 | 0 |
| 0.7243055555555555 | 0 |
| 0.725 | 0 |
| 0.7256944444444445 | 0 |
| 0.7263888888888889 | 0 |
| 0.7270833333333333 | 0 |
| 0.7277777777777777 | 0 |
| 0.7284722222222223 | 0 |
| 0.7291666666666666 | 0 |
| 0.7298611111111111 | 0 |
| 0.7305555555555556 | 0 |
| 0.7312500000000001 | 0 |
| 0.7319444444444444 | 0 |
| 0.7326388888888888 | 0 |
| 0.7333333333333334 | 0 |
| 0.7340277777777778 | 0 |
| 0.7347222222222222 | 0 |
| 0.7354166666666666 | 0 |
| 0.7361111111111112 | 0 |
| 0.7368055555555556 | 0 |
| 0.7374999999999999 | 0 |
| 0.7381944444444444 | 0 |
| 0.7388888888888889 | 0 |
| 0.7395833333333334 | 0 |
| 0.7402777777777777 | 0 |
| 0.7409722222222223 | 0 |
| 0.7416666666666667 | 0 |
| 0.7423611111111111 | 0 |
| 0.7430555555555555 | 0 |
| 0.74375 | 0 |
| 0.7444444444444445 | 0 |
| 0.7451388888888889 | 0 |
| 0.7458333333333332 | 0 |
| 0.7465277777777778 | 0 |
| 0.7472222222222222 | 0 |
| 0.7479166666666667 | 0 |
| 0.748611111111111 | 0 |
| 0.7493055555555556 | 0 |
| 0.75 | 0 |
| 0.7506944444444444 | 0 |
| 0.751388888888889 | 0 |
| 0.7520833333333333 | 0 |
| 0.7527777777777778 | 0 |
| 0.7534722222222222 | 0 |
| 0.7541666666666668 | 0 |
| 0.7548611111111111 | 0 |
| 0.7555555555555555 | 0 |
| 0.75625 | 0 |
| 0.7569444444444445 | 0 |
| 0.7576388888888889 | 0 |
| 0.7583333333333333 | 0 |
| 0.7590277777777777 | 0 |
| 0.7597222222222223 | 0 |
| 0.7604166666666666 | 0 |
| 0.7611111111111111 | 0 |
| 0.7618055555555556 | 0 |
| 0.7625000000000001 | 0 |
| 0.7631944444444444 | 0 |
| 0.7638888888888888 | 0 |
| 0.7645833333333334 | 0 |
| 0.7652777777777778 | 0 |
| 0.7659722222222222 | 0 |
| 0.7666666666666666 | 0 |
| 0.7673611111111112 | 0 |
| 0.7680555555555556 | 0 |
| 0.7687499999999999 | 0 |
| 0.7694444444444444 | 0 |
| 0.7701388888888889 | 0 |
| 0.7708333333333334 | 0 |
| 0.7715277777777777 | 0 |
| 0.7722222222222223 | 0 |
| 0.7729166666666667 | 0 |
| 0.7736111111111111 | 0 |
| 0.7743055555555555 | 0 |
| 0.775 | 0 |
| 0.7756944444444445 | 0 |
| 0.7763888888888889 | 0 |
| 0.7770833333333332 | 0 |
| 0.7777777777777778 | 0 |
| 0.7784722222222222 | 0 |
| 0.7791666666666667 | 0 |
| 0.779861111111111 | 0 |
| 0.7805555555555556 | 0 |
| 0.78125 | 0 |
| 0.7819444444444444 | 0 |
| 0.782638888888889 | 0 |
| 0.7833333333333333 | 0 |
| 0.7840277777777778 | 0 |
| 0.7847222222222222 | 0 |
| 0.7854166666666668 | 0 |
| 0.7861111111111111 | 0 |
| 0.7868055555555555 | 0 |
| 0.7875 | 0 |
| 0.7881944444444445 | 0 |
| 0.7888888888888889 | 0 |
| 0.7895833333333333 | 0 |
| 0.7902777777777777 | 0 |
| 0.7909722222222223 | 0 |
| 0.7916666666666666 | 0 |
| 0.7923611111111111 | 0 |
| 0.7930555555555556 | 0 |
| 0.7937500000000001 | 0 |
| 0.7944444444444444 | 0 |
| 0.7951388888888888 | 0 |
| 0.7958333333333334 | 0 |
| 0.7965277777777778 | 0 |
| 0.7972222222222222 | 0 |
| 0.7979166666666666 | 0 |
| 0.7986111111111112 | 0 |
| 0.7993055555555556 | 0 |
| 0.7999999999999999 | 0 |
| 0.8006944444444444 | 0 |
| 0.8013888888888889 | 0 |
| 0.8020833333333334 | 0 |
| 0.8027777777777777 | 0 |
| 0.8034722222222223 | 0 |
| 0.8041666666666667 | 0 |
| 0.8048611111111111 | 0 |
| 0.8055555555555555 | 0 |
| 0.80625 | 0 |
| 0.8069444444444445 | 0 |
| 0.8076388888888889 | 0 |
| 0.8083333333333332 | 0 |
| 0.8090277777777778 | 0 |
| 0.8097222222222222 | 0 |
| 0.8104166666666667 | 0 |
| 0.811111111111111 | 0 |
| 0.8118055555555556 | 0 |
| 0.8125 | 0 |
| 0.8131944444444444 | 0 |
| 0.813888888888889 | 0 |
| 0.8145833333333333 | 0 |
| 0.8152777777777778 | 0 |
| 0.8159722222222222 | 0 |
| 0.8166666666666668 | 0 |
| 0.8173611111111111 | 0 |
| 0.8180555555555555 | 0 |
| 0.81875 | 0 |
| 0.8194444444444445 | 0 |
| 0.8201388888888889 | 0 |
| 0.8208333333333333 | 0 |
| 0.8215277777777777 | 0 |
| 0.8222222222222223 | 0 |
| 0.8229166666666666 | 0 |
| 0.8236111111111111 | 0 |
| 0.8243055555555556 | 0 |
| 0.8250000000000001 | 0 |
| 0.8256944444444444 | 0 |
| 0.8263888888888888 | 0 |
| 0.8270833333333334 | 0 |
| 0.8277777777777778 | 0 |
| 0.8284722222222222 | 0 |
| 0.8291666666666666 | 0 |
| 0.8298611111111112 | 0 |
| 0.8305555555555556 | 0 |
| 0.8312499999999999 | 0 |
| 0.8319444444444444 | 0 |
| 0.8326388888888889 | 0 |
| 0.8333333333333334 | 0 |
| 0.8340277777777777 | 0 |
| 0.8347222222222223 | 0 |
| 0.8354166666666667 | 0 |
| 0.8361111111111111 | 0 |
| 0.8368055555555555 | 0 |
| 0.8375 | 0 |
| 0.8381944444444445 | 0 |
| 0.8388888888888889 | 0 |
| 0.8395833333333332 | 0 |
| 0.8402777777777778 | 0 |
| 0.8409722222222222 | 0 |
| 0.8416666666666667 | 0 |
| 0.842361111111111 | 0 |
| 0.8430555555555556 | 0 |
| 0.84375 | 0 |
| 0.8444444444444444 | 0 |
| 0.845138888888889 | 0 |
| 0.8458333333333333 | 0 |
| 0.8465277777777778 | 0 |
| 0.8472222222222222 | 0 |
| 0.8479166666666668 | 0 |
| 0.8486111111111111 | 0 |
| 0.8493055555555555 | 0 |
| 0.85 | 0 |
| 0.8506944444444445 | 0 |
| 0.8513888888888889 | 0 |
| 0.8520833333333333 | 0 |
| 0.8527777777777777 | 0 |
| 0.8534722222222223 | 0 |
| 0.8541666666666666 | 0 |
| 0.8548611111111111 | 0 |
| 0.8555555555555556 | 0 |
| 0.8562500000000001 | 0 |
| 0.8569444444444444 | 0 |
| 0.8576388888888888 | 0 |
| 0.8583333333333334 | 0 |
| 0.8590277777777778 | 0 |
| 0.8597222222222222 | 0 |
| 0.8604166666666666 | 0 |
| 0.8611111111111112 | 0 |
| 0.8618055555555556 | 0 |
| 0.8624999999999999 | 0 |
| 0.8631944444444444 | 0 |
| 0.8638888888888889 | 0 |
| 0.8645833333333334 | 0 |
| 0.8652777777777777 | 0 |
| 0.8659722222222223 | 0 |
| 0.8666666666666667 | 0 |
| 0.8673611111111111 | 0 |
| 0.8680555555555555 | 0 |
| 0.86875 | 0 |
| 0.8694444444444445 | 0 |
| 0.8701388888888889 | 0 |
| 0.8708333333333332 | 0 |
| 0.8715277777777778 | 0 |
| 0.8722222222222222 | 0 |
| 0.8729166666666667 | 0 |
| 0.873611111111111 | 0 |
| 0.8743055555555556 | 0 |
| 0.875 | 0 |
| 0.8756944444444444 | 0 |
| 0.876388888888889 | 0 |
| 0.8770833333333333 | 0 |
| 0.8777777777777778 | 0 |
| 0.8784722222222222 | 0 |
| 0.8791666666666668 | 0 |
| 0.8798611111111111 | 0 |
| 0.8805555555555555 | 0 |
| 0.88125 | 0 |
| 0.8819444444444445 | 0 |
| 0.8826388888888889 | 0 |
| 0.8833333333333333 | 0 |
| 0.8840277777777777 | 0 |
| 0.8847222222222223 | 0 |
| 0.8854166666666666 | 0 |
| 0.8861111111111111 | 0 |
| 0.8868055555555556 | 0 |
| 0.8875000000000001 | 0 |
| 0.8881944444444444 | 0 |
| 0.8888888888888888 | 0 |
| 0.8895833333333334 | 0 |
| 0.8902777777777778 | 0 |
| 0.8909722222222222 | 0 |
| 0.8916666666666666 | 0 |
| 0.8923611111111112 | 0 |
| 0.8930555555555556 | 0 |
| 0.8937499999999999 | 0 |
| 0.8944444444444444 | 0 |
| 0.8951388888888889 | 0 |
| 0.8958333333333334 | 0 |
| 0.8965277777777777 | 0 |
| 0.8972222222222223 | 0 |
| 0.8979166666666667 | 0 |
| 0.8986111111111111 | 0 |
| 0.8993055555555555 | 0 |
| 0.9 | 0 |
| 0.9006944444444445 | 0 |
| 0.9013888888888889 | 0 |
| 0.9020833333333332 | 0 |
| 0.9027777777777778 | 0 |
| 0.9034722222222222 | 0 |
| 0.9041666666666667 | 0 |
| 0.904861111111111 | 0 |
| 0.9055555555555556 | 0 |
| 0.90625 | 0 |
| 0.9069444444444444 | 0 |
| 0.907638888888889 | 0 |
| 0.9083333333333333 | 0 |
| 0.9090277777777778 | 0 |
| 0.9097222222222222 | 0 |
| 0.9104166666666668 | 0 |
| 0.9111111111111111 | 0 |
| 0.9118055555555555 | 0 |
| 0.9125 | 0 |
| 0.9131944444444445 | 0 |
| 0.9138888888888889 | 0 |
| 0.9145833333333333 | 0 |
| 0.9152777777777777 | 0 |
| 0.9159722222222223 | 0 |
| 0.9166666666666666 | 0 |
| 0.9173611111111111 | 0 |
| 0.9180555555555556 | 0 |
| 0.9187500000000001 | 0 |
| 0.9194444444444444 | 0 |
| 0.9201388888888888 | 0 |
| 0.9208333333333334 | 0 |
| 0.9215277777777778 | 0 |
| 0.9222222222222222 | 0 |
| 0.9229166666666666 | 0 |
| 0.9236111111111112 | 0 |
| 0.9243055555555556 | 0 |
| 0.9249999999999999 | 0 |
| 0.9256944444444444 | 0 |
| 0.9263888888888889 | 0 |
| 0.9270833333333334 | 0 |
| 0.9277777777777777 | 0 |
| 0.9284722222222223 | 0 |
| 0.9291666666666667 | 0 |
| 0.9298611111111111 | 0 |
| 0.9305555555555555 | 0 |
| 0.93125 | 0 |
| 0.9319444444444445 | 0 |
| 0.9326388888888889 | 0 |
| 0.9333333333333332 | 0 |
| 0.9340277777777778 | 0 |
| 0.9347222222222222 | 0 |
| 0.9354166666666667 | 0 |
| 0.936111111111111 | 0 |
| 0.9368055555555556 | 0 |
| 0.9375 | 0 |
| 0.9381944444444444 | 0 |
| 0.938888888888889 | 0 |
| 0.9395833333333333 | 0 |
| 0.9402777777777778 | 0 |
| 0.9409722222222222 | 0 |
| 0.9416666666666668 | 0 |
| 0.9423611111111111 | 0 |
| 0.9430555555555555 | 0 |
| 0.94375 | 0 |
| 0.9444444444444445 | 0 |
| 0.9451388888888889 | 0 |
| 0.9458333333333333 | 0 |
| 0.9465277777777777 | 0 |
| 0.9472222222222223 | 0 |
| 0.9479166666666666 | 0 |
| 0.9486111111111111 | 0 |
| 0.9493055555555556 | 0 |
| 0.9500000000000001 | 0 |
| 0.9506944444444444 | 0 |
| 0.9513888888888888 | 0 |
| 0.9520833333333334 | 0 |
| 0.9527777777777778 | 0 |
| 0.9534722222222222 | 0 |
| 0.9541666666666666 | 0 |
| 0.9548611111111112 | 0 |
| 0.9555555555555556 | 0 |
| 0.9562499999999999 | 0 |
| 0.9569444444444444 | 0 |
| 0.9576388888888889 | 0 |
| 0.9583333333333334 | 0 |
| 0.9590277777777777 | 0 |
| 0.9597222222222223 | 0 |
| 0.9604166666666667 | 0 |
| 0.9611111111111111 | 0 |
| 0.9618055555555555 | 0 |
| 0.9625 | 0 |
| 0.9631944444444445 | 0 |
| 0.9638888888888889 | 0 |
| 0.9645833333333332 | 0 |
| 0.9652777777777778 | 0 |
| 0.9659722222222222 | 0 |
| 0.9666666666666667 | 0 |
| 0.967361111111111 | 0 |
| 0.9680555555555556 | 0 |
| 0.96875 | 0 |
| 0.9694444444444444 | 0 |
| 0.970138888888889 | 0 |
| 0.9708333333333333 | 0 |
| 0.9715277777777778 | 0 |
| 0.9722222222222222 | 0 |
| 0.9729166666666668 | 0 |
| 0.9736111111111111 | 0 |
| 0.9743055555555555 | 0 |
| 0.975 | 0 |
| 0.9756944444444445 | 0 |
| 0.9763888888888889 | 0 |
| 0.9770833333333333 | 0 |
| 0.9777777777777777 | 0 |
| 0.9784722222222223 | 0 |
| 0.9791666666666666 | 0 |
| 0.9798611111111111 | 0 |
| 0.9805555555555556 | 0 |
| 0.9812500000000001 | 0 |
| 0.9819444444444444 | 0 |
| 0.9826388888888888 | 0 |
| 0.9833333333333334 | 0 |
| 0.9840277777777778 | 0 |
| 0.9847222222222222 | 0 |
| 0.9854166666666666 | 0 |
| 0.9861111111111112 | 0 |
| 0.9868055555555556 | 0 |
| 0.9874999999999999 | 0 |
| 0.9881944444444444 | 0 |
| 0.9888888888888889 | 0 |
| 0.9895833333333334 | 0 |
| 0.9902777777777777 | 0 |
| 0.9909722222222223 | 0 |
| 0.9916666666666667 | 0 |
| 0.9923611111111111 | 0 |
| 0.9930555555555555 | 0 |
| 0.99375 | 0 |
| 0.9944444444444445 | 0 |
| 0.9951388888888889 | 0 |
| 0.9958333333333332 | 0 |
| 0.9965277777777778 | 0 |
| 0.9972222222222222 | 0 |
| 0.9979166666666667 | 0 |
| 0.998611111111111 | 0 |
| 0.9993055555555556 | 0 |